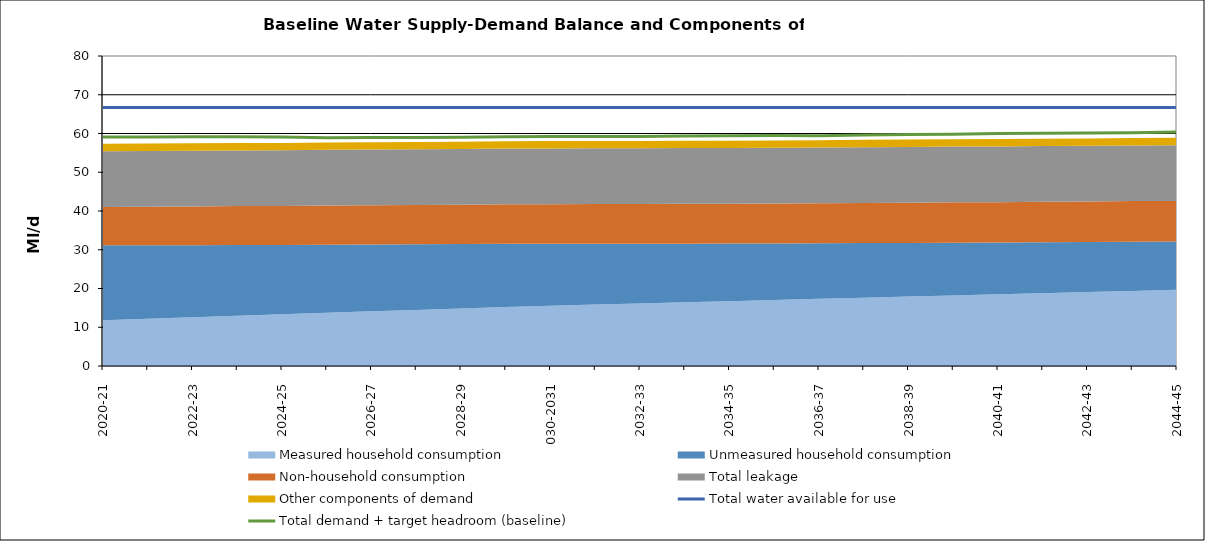
| Category | Total water available for use | Total demand + target headroom (baseline) |
|---|---|---|
| 0 | 66.707 | 59.1 |
| 1 | 66.707 | 59.117 |
| 2 | 66.707 | 59.151 |
| 3 | 66.707 | 59.173 |
| 4 | 66.707 | 59.127 |
| 5 | 66.707 | 58.891 |
| 6 | 66.707 | 58.952 |
| 7 | 66.707 | 58.964 |
| 8 | 66.707 | 59.043 |
| 9 | 66.707 | 59.184 |
| 10 | 66.707 | 59.217 |
| 11 | 66.707 | 59.224 |
| 12 | 66.707 | 59.221 |
| 13 | 66.707 | 59.345 |
| 14 | 66.707 | 59.392 |
| 15 | 66.707 | 59.478 |
| 16 | 66.707 | 59.44 |
| 17 | 66.707 | 59.613 |
| 18 | 66.707 | 59.734 |
| 19 | 66.707 | 59.831 |
| 20 | 66.707 | 59.988 |
| 21 | 66.707 | 60.049 |
| 22 | 66.707 | 60.119 |
| 23 | 66.707 | 60.213 |
| 24 | 66.707 | 60.376 |